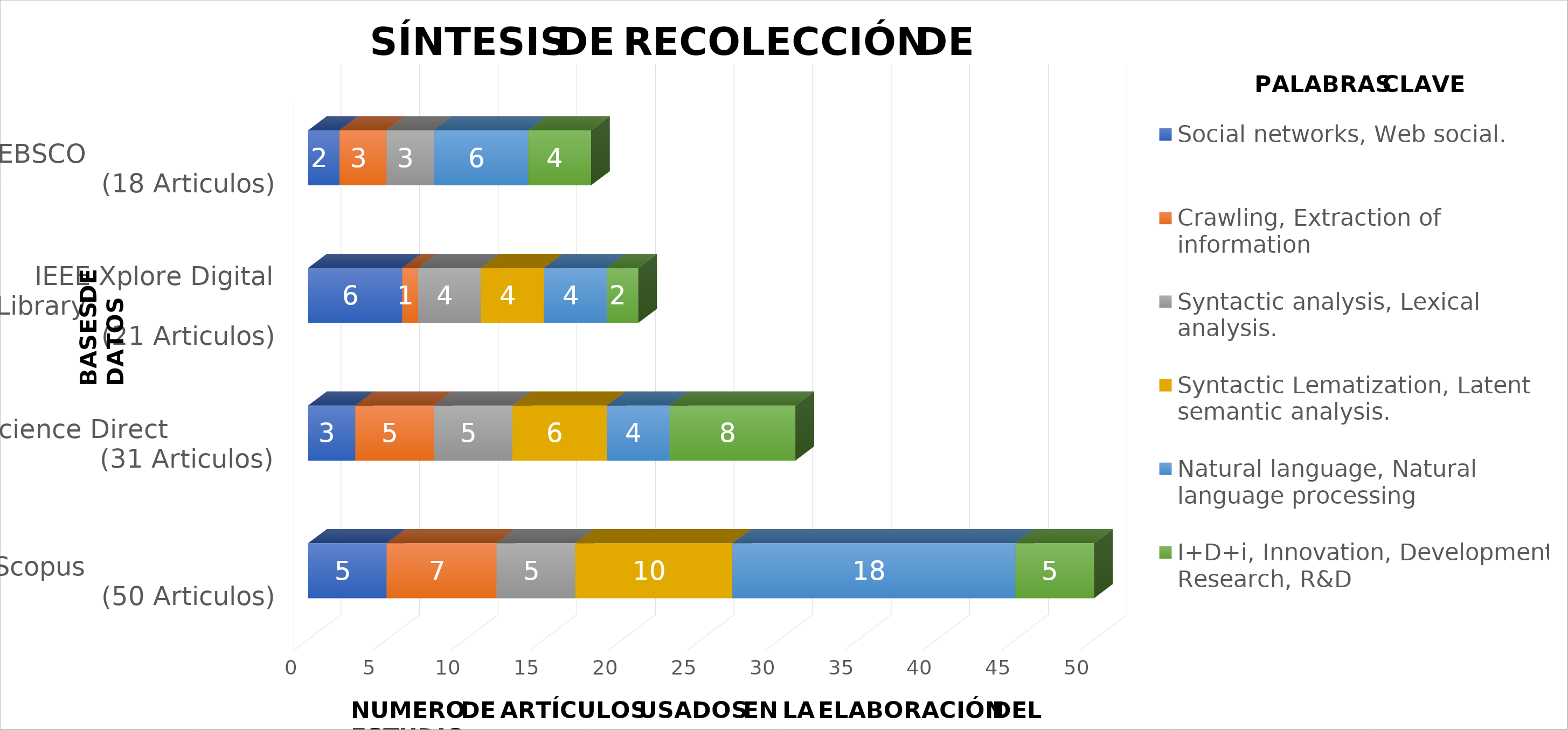
| Category | Social networks, Web social. | Crawling, Extraction of information | Syntactic analysis, Lexical analysis. | Syntactic Lematization, Latent semantic analysis. | Natural language, Natural language processing | I+D+i, Innovation, Development, Research, R&D |
|---|---|---|---|---|---|---|
| Scopus                        (50 Articulos) | 5 | 7 | 5 | 10 | 18 | 5 |
| Science Direct                        (31 Articulos) | 3 | 5 | 5 | 6 | 4 | 8 |
| IEEE Xplore Digital Library                        (21 Articulos) | 6 | 1 | 4 | 4 | 4 | 2 |
| EBSCO                        (18 Articulos) | 2 | 3 | 3 | 0 | 6 | 4 |